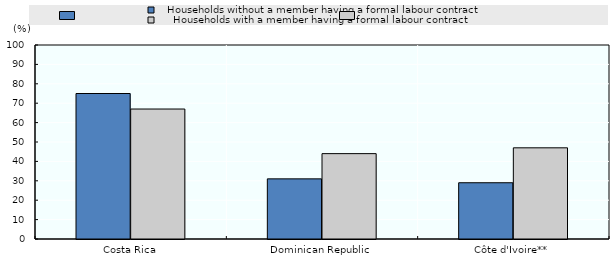
| Category |    Households without a member having a formal labour contract |      Households with a member having a formal labour contract |
|---|---|---|
| Costa Rica | 75 | 67 |
| Dominican Republic | 31 | 44 |
| Côte d'Ivoire** | 29 | 47 |